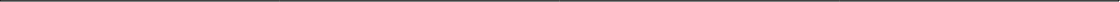
| Category | Daily Average Air Temperature (°C) |
|---|---|
| 41087.0 | 12.5 |
| 41088.0 | 15.3 |
| 41089.0 | 13.8 |
| 41090.0 | 11.3 |
| 41091.0 | 14.637 |
| 41092.0 | 12.462 |
| 41093.0 | 12.333 |
| 41094.0 | 10.783 |
| 41095.0 | 13.946 |
| 41096.0 | 16.646 |
| 41097.0 | 15.425 |
| 41098.0 | 14.175 |
| 41099.0 | 15.021 |
| 41100.0 | 10.642 |
| 41101.0 | 9.742 |
| 41102.0 | 13.571 |
| 41103.0 | 14.421 |
| 41104.0 | 16.383 |
| 41105.0 | 15.308 |
| 41106.0 | 13.992 |
| 41107.0 | 13.417 |
| 41108.0 | 14.183 |
| 41109.0 | 12.825 |
| 41110.0 | 13.954 |
| 41117.0 | 19.908 |
| 41118.0 | 18.5 |
| 41119.0 | 16.788 |
| 41120.0 | 15.812 |
| 41121.0 | 14.521 |
| 41122.0 | 14.321 |
| 41123.0 | 14.071 |
| 41124.0 | 12.196 |
| 41125.0 | 11.5 |
| 41126.0 | 10.754 |
| 41127.0 | 13.938 |
| 41128.0 | 17.583 |
| 41129.0 | 15.271 |
| 41130.0 | 14.404 |
| 41131.0 | 15.538 |
| 41132.0 | 14.1 |
| 41133.0 | 12.454 |
| 41134.0 | 15.4 |
| 41135.0 | 13.654 |
| 41136.0 | 15.183 |
| 41137.0 | 15.654 |
| 41138.0 | 13.908 |
| 41139.0 | 11.446 |
| 41139.0 | 11.4 |
| 41140.0 | 11.083 |
| 41140.0 | 11.1 |
| 41141.0 | 12.042 |
| 41142.0 | 14.129 |
| 41143.0 | 13.825 |
| 41144.0 | 9.683 |
| 41145.0 | 14.608 |
| 41146.0 | 12.758 |
| 41147.0 | 9.767 |
| 41148.0 | 8.65 |
| 41149.0 | 7.517 |
| 41150.0 | 6.792 |
| 41151.0 | 8.958 |
| 41152.0 | 8.825 |
| 41153.0 | 8.742 |
| 41154.0 | 9.229 |
| 41155.0 | 7.375 |
| 41156.0 | 10.9 |
| 41157.0 | 8.817 |
| 41158.0 | 8.438 |
| 41159.0 | 3.267 |
| 41160.0 | 5.3 |
| 41161.0 | 3.2 |
| 41162.0 | 0.712 |